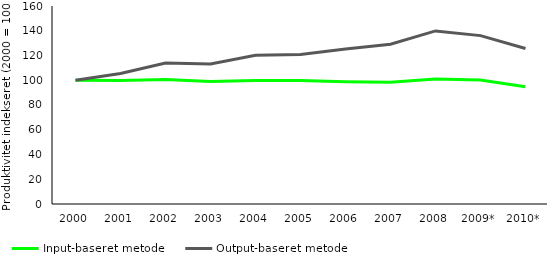
| Category | Input-baseret metode | Output-baseret metode |
|---|---|---|
| 2000 | 100 | 100 |
| 2001 | 99.829 | 105.517 |
| 2002 | 100.672 | 113.888 |
| 2003 | 98.897 | 113.204 |
| 2004 | 99.856 | 120.131 |
| 2005 | 99.832 | 120.83 |
| 2006 | 98.791 | 125.22 |
| 2007 | 98.377 | 129.129 |
| 2008 | 101.089 | 139.872 |
| 2009* | 100.276 | 136.078 |
| 2010* | 94.759 | 125.634 |